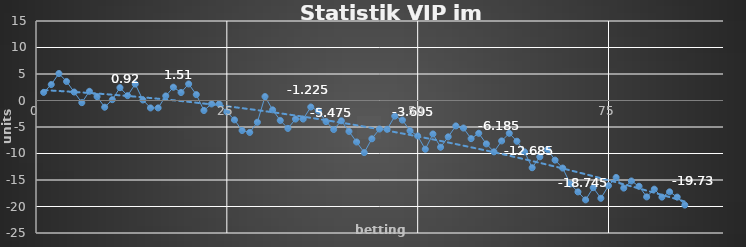
| Category | Series 0 |
|---|---|
| 0 | 1.53 |
| 1 | 3.015 |
| 2 | 5.095 |
| 3 | 3.595 |
| 4 | 1.595 |
| 5 | -0.405 |
| 6 | 1.735 |
| 7 | 0.735 |
| 8 | -1.265 |
| 9 | 0.16 |
| 10 | 2.42 |
| 11 | 0.92 |
| 12 | 3.1 |
| 13 | 0.1 |
| 14 | -1.4 |
| 15 | -1.4 |
| 16 | 0.86 |
| 17 | 2.51 |
| 18 | 1.51 |
| 19 | 3.12 |
| 20 | 1.12 |
| 21 | -1.88 |
| 22 | -0.65 |
| 23 | -0.65 |
| 24 | -2.15 |
| 25 | -3.65 |
| 26 | -5.65 |
| 27 | -6.02 |
| 28 | -4.1 |
| 29 | 0.74 |
| 30 | -1.76 |
| 31 | -3.76 |
| 32 | -5.26 |
| 33 | -3.5 |
| 34 | -3.5 |
| 35 | -1.225 |
| 36 | -1.975 |
| 37 | -3.975 |
| 38 | -5.475 |
| 39 | -3.825 |
| 40 | -5.825 |
| 41 | -7.825 |
| 42 | -9.825 |
| 43 | -7.225 |
| 44 | -5.385 |
| 45 | -5.435 |
| 46 | -2.945 |
| 47 | -3.695 |
| 48 | -5.695 |
| 49 | -6.695 |
| 50 | -9.195 |
| 51 | -6.315 |
| 52 | -8.815 |
| 53 | -6.855 |
| 54 | -4.795 |
| 55 | -5.195 |
| 56 | -7.195 |
| 57 | -6.185 |
| 58 | -8.185 |
| 59 | -9.685 |
| 60 | -7.625 |
| 61 | -6.185 |
| 62 | -7.685 |
| 63 | -9.685 |
| 64 | -12.685 |
| 65 | -10.625 |
| 66 | -9.245 |
| 67 | -11.245 |
| 68 | -12.745 |
| 69 | -15.745 |
| 70 | -17.245 |
| 71 | -18.745 |
| 72 | -16.445 |
| 73 | -18.445 |
| 74 | -16.07 |
| 75 | -14.525 |
| 76 | -16.525 |
| 77 | -15.185 |
| 78 | -16.185 |
| 79 | -18.185 |
| 80 | -16.73 |
| 81 | -18.23 |
| 82 | -17.23 |
| 83 | -18.23 |
| 84 | -19.73 |